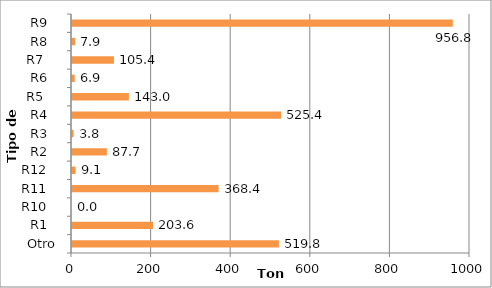
| Category | Series 0 |
|---|---|
| Otro | 519.803 |
| R1   | 203.56 |
| R10   | 0 |
| R11   | 368.382 |
| R12   | 9.141 |
| R2   | 87.744 |
| R3   | 3.814 |
| R4   | 525.372 |
| R5    | 142.96 |
| R6   | 6.88 |
| R7    | 105.398 |
| R8   | 7.933 |
| R9   | 956.779 |